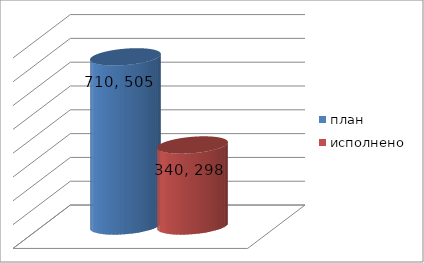
| Category | план | исполнено |
|---|---|---|
| 0 | 710505780.63 | 340298665.24 |